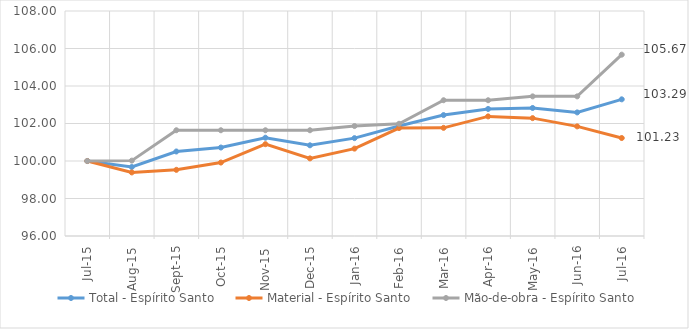
| Category | Total - Espírito Santo | Material - Espírito Santo | Mão-de-obra - Espírito Santo |
|---|---|---|---|
| 2015-07-01 | 100 | 100 | 100 |
| 2015-08-01 | 99.68 | 99.39 | 100.02 |
| 2015-09-01 | 100.507 | 99.529 | 101.64 |
| 2015-10-01 | 100.718 | 99.917 | 101.64 |
| 2015-11-01 | 101.242 | 100.896 | 101.64 |
| 2015-12-01 | 100.837 | 100.14 | 101.64 |
| 2016-01-01 | 101.22 | 100.661 | 101.864 |
| 2016-02-01 | 101.868 | 101.758 | 101.986 |
| 2016-03-01 | 102.449 | 101.768 | 103.241 |
| 2016-04-01 | 102.777 | 102.378 | 103.241 |
| 2016-05-01 | 102.828 | 102.286 | 103.447 |
| 2016-06-01 | 102.592 | 101.847 | 103.447 |
| 2016-07-01 | 103.289 | 101.225 | 105.671 |